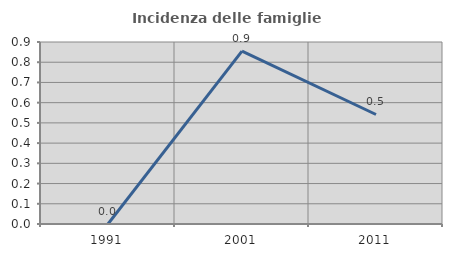
| Category | Incidenza delle famiglie numerose |
|---|---|
| 1991.0 | 0 |
| 2001.0 | 0.855 |
| 2011.0 | 0.542 |